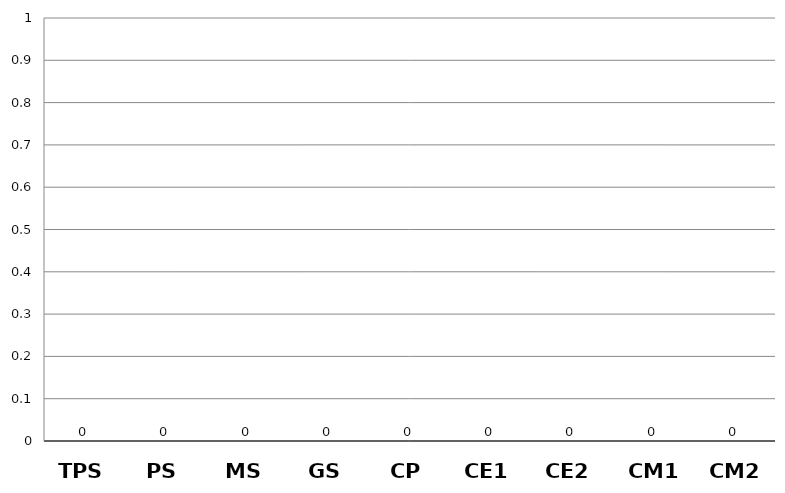
| Category | Series 0 |
|---|---|
| TPS | 0 |
| PS | 0 |
| MS | 0 |
| GS | 0 |
| CP | 0 |
| CE1 | 0 |
| CE2 | 0 |
| CM1 | 0 |
| CM2 | 0 |